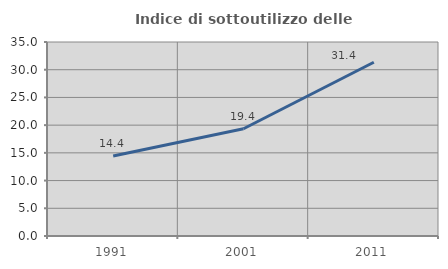
| Category | Indice di sottoutilizzo delle abitazioni  |
|---|---|
| 1991.0 | 14.419 |
| 2001.0 | 19.355 |
| 2011.0 | 31.352 |